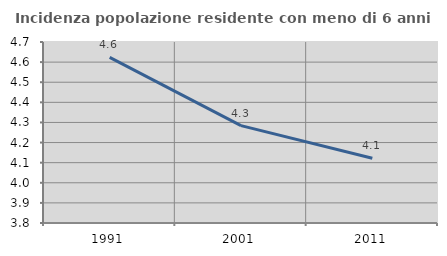
| Category | Incidenza popolazione residente con meno di 6 anni |
|---|---|
| 1991.0 | 4.623 |
| 2001.0 | 4.284 |
| 2011.0 | 4.122 |